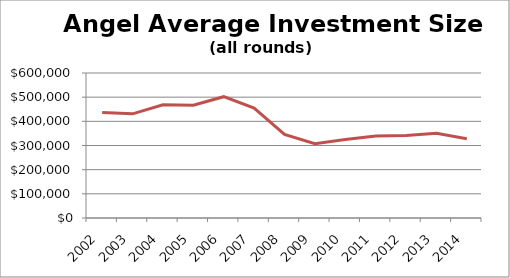
| Category | Avg Investment |
|---|---|
| 2002.0 | 436111.111 |
| 2003.0 | 430952.381 |
| 2004.0 | 468750 |
| 2005.0 | 466666.667 |
| 2006.0 | 501960.784 |
| 2007.0 | 455182.073 |
| 2008.0 | 346070.656 |
| 2009.0 | 307557.886 |
| 2010.0 | 324717.286 |
| 2011.0 | 339725.2 |
| 2012.0 | 341638.073 |
| 2013.0 | 350629.153 |
| 2014.0 | 328337.875 |